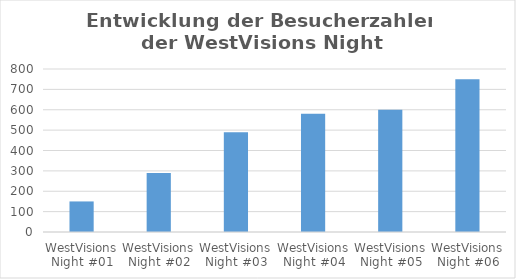
| Category | Series 0 |
|---|---|
| WestVisions Night #01 | 150 |
| WestVisions Night #02 | 290 |
| WestVisions Night #03 | 490 |
| WestVisions Night #04 | 580 |
| WestVisions Night #05 | 600 |
| WestVisions Night #06 | 750 |